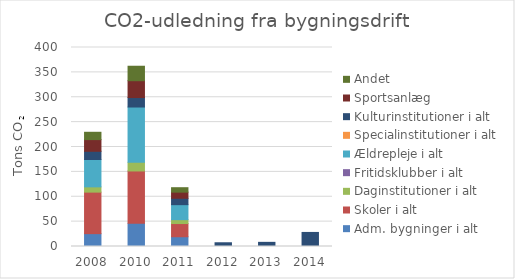
| Category | Adm. bygninger i alt | Skoler i alt | Daginstitutioner i alt | Fritidsklubber i alt | Ældrepleje i alt | Specialinstitutioner i alt | Kulturinstitutioner i alt | Sportsanlæg | Andet |
|---|---|---|---|---|---|---|---|---|---|
| 2008.0 | 25.832 | 83.458 | 10.586 | 0 | 54.942 | 0 | 16.575 | 23.467 | 14.723 |
| 2010.0 | 46.551 | 105.282 | 17.316 | 0 | 111.216 | 0 | 19.024 | 33.86 | 29.073 |
| 2011.0 | 19.605 | 26.556 | 7.808 | 0 | 30.129 | 0 | 12.845 | 12.308 | 8.934 |
| 2012.0 | 0 | 0 | 0 | 0 | 0 | 0 | 7.511 | 0 | 0 |
| 2013.0 | 0 | 0 | 0 | 0 | 0 | 0 | 8.346 | 0 | 0 |
| 2014.0 | 0 | 0 | 0 | 0 | 0 | 0 | 28.259 | 0 | 0 |